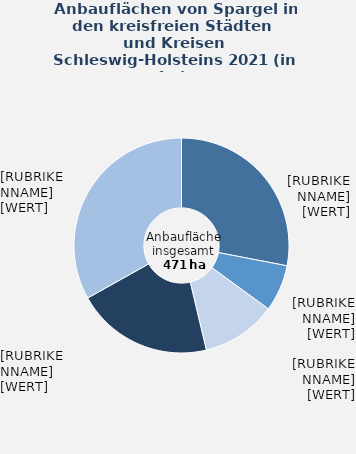
| Category | Spargel |
|---|---|
| Herzogtum Lauenburg | 132 |
| Ostholstein | 33 |
| Rendsburg-Eckernförde | 53 |
| Segeberg | 97 |
| übrige kreisfreie Städte und Kreise | 156 |